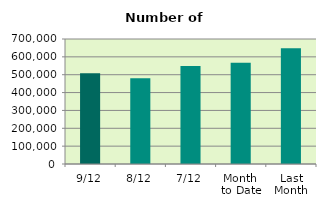
| Category | Series 0 |
|---|---|
| 9/12 | 508584 |
| 8/12 | 480734 |
| 7/12 | 548894 |
| Month 
to Date | 567005.429 |
| Last
Month | 647745.364 |